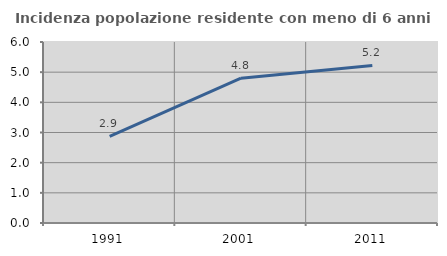
| Category | Incidenza popolazione residente con meno di 6 anni |
|---|---|
| 1991.0 | 2.874 |
| 2001.0 | 4.801 |
| 2011.0 | 5.222 |